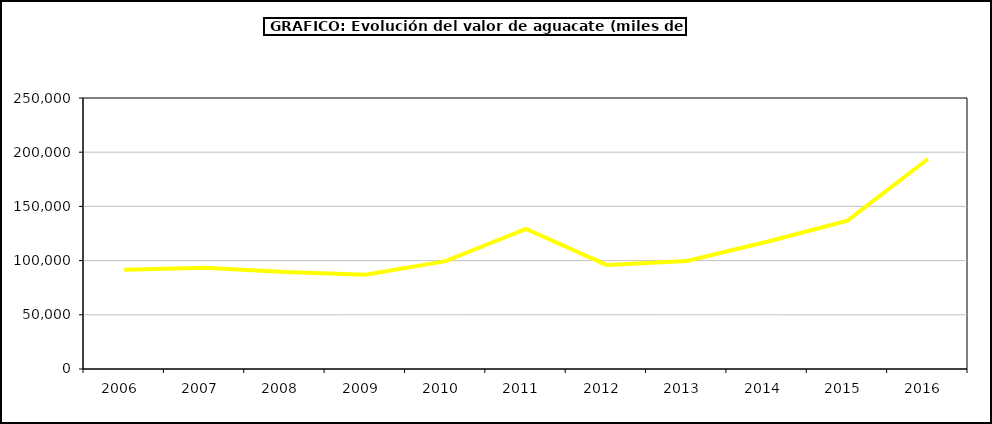
| Category | valor aguacate |
|---|---|
| 2006.0 | 91598.04 |
| 2007.0 | 93472.643 |
| 2008.0 | 89391.058 |
| 2009.0 | 86892.648 |
| 2010.0 | 99524.152 |
| 2011.0 | 129297.627 |
| 2012.0 | 96001.411 |
| 2013.0 | 99613.86 |
| 2014.0 | 117384.488 |
| 2015.0 | 136798 |
| 2016.0 | 193742 |